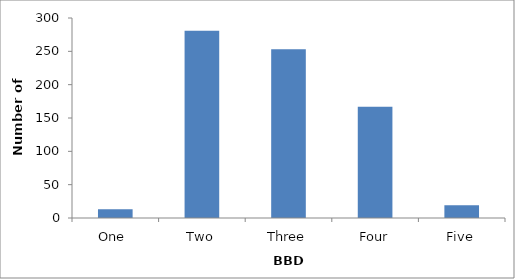
| Category | Series 0 |
|---|---|
| One  | 13 |
| Two | 281 |
| Three | 253 |
| Four | 167 |
| Five | 19 |